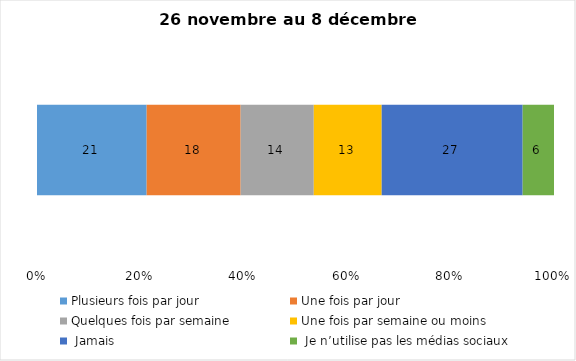
| Category | Plusieurs fois par jour | Une fois par jour | Quelques fois par semaine   | Une fois par semaine ou moins   |  Jamais   |  Je n’utilise pas les médias sociaux |
|---|---|---|---|---|---|---|
| 0 | 21 | 18 | 14 | 13 | 27 | 6 |